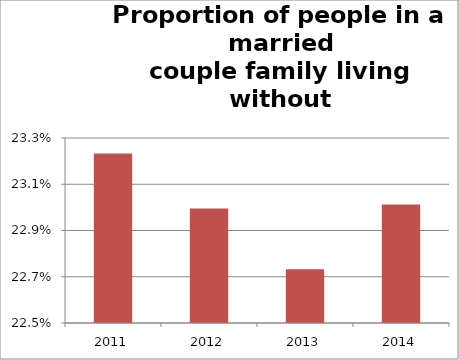
| Category | Series 1 |
|---|---|
| 2011.0 | 0.232 |
| 2012.0 | 0.23 |
| 2013.0 | 0.227 |
| 2014.0 | 0.23 |